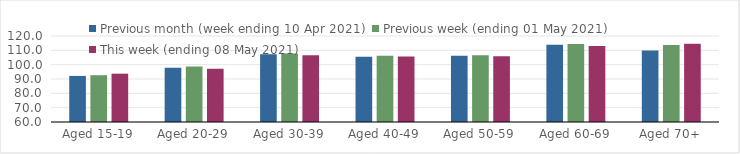
| Category | Previous month (week ending 10 Apr 2021) | Previous week (ending 01 May 2021) | This week (ending 08 May 2021) |
|---|---|---|---|
| Aged 15-19 | 92.15 | 92.65 | 93.71 |
| Aged 20-29 | 97.9 | 98.73 | 97.08 |
| Aged 30-39 | 107.26 | 107.76 | 106.53 |
| Aged 40-49 | 105.45 | 106.28 | 105.66 |
| Aged 50-59 | 106.17 | 106.57 | 105.79 |
| Aged 60-69 | 113.82 | 114.43 | 113.09 |
| Aged 70+ | 109.86 | 113.7 | 114.62 |